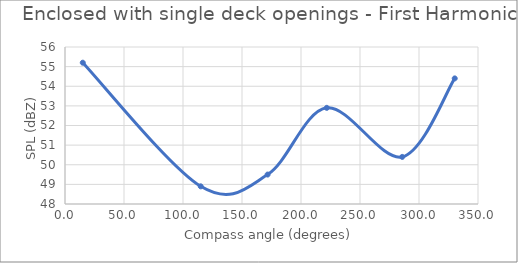
| Category | Series 0 |
|---|---|
| 15.06445125542554 | 55.2 |
| 115.00449447818254 | 48.9 |
| 171.7068171198818 | 49.5 |
| 221.8691292075067 | 52.9 |
| 285.7828166838848 | 50.4 |
| 330.28010595813004 | 54.4 |